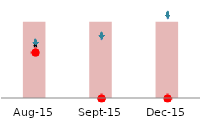
| Category | Series 1 |
|---|---|
| 2015-08-01 | 158.91 |
| 2015-09-01 | 158.91 |
| 2015-12-01 | 158.91 |